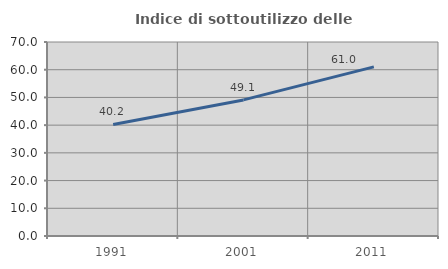
| Category | Indice di sottoutilizzo delle abitazioni  |
|---|---|
| 1991.0 | 40.237 |
| 2001.0 | 49.102 |
| 2011.0 | 61.039 |